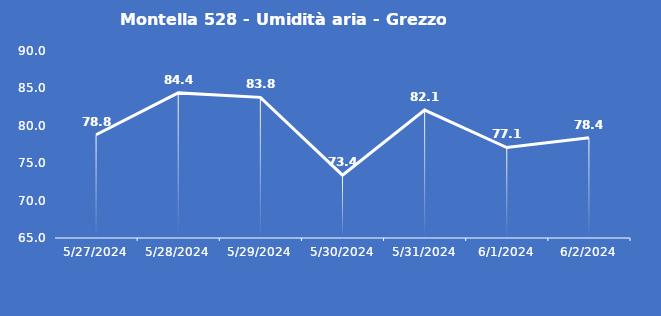
| Category | Montella 528 - Umidità aria - Grezzo (%) |
|---|---|
| 5/27/24 | 78.8 |
| 5/28/24 | 84.4 |
| 5/29/24 | 83.8 |
| 5/30/24 | 73.4 |
| 5/31/24 | 82.1 |
| 6/1/24 | 77.1 |
| 6/2/24 | 78.4 |